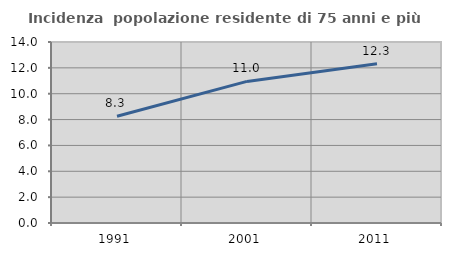
| Category | Incidenza  popolazione residente di 75 anni e più |
|---|---|
| 1991.0 | 8.256 |
| 2001.0 | 10.953 |
| 2011.0 | 12.32 |